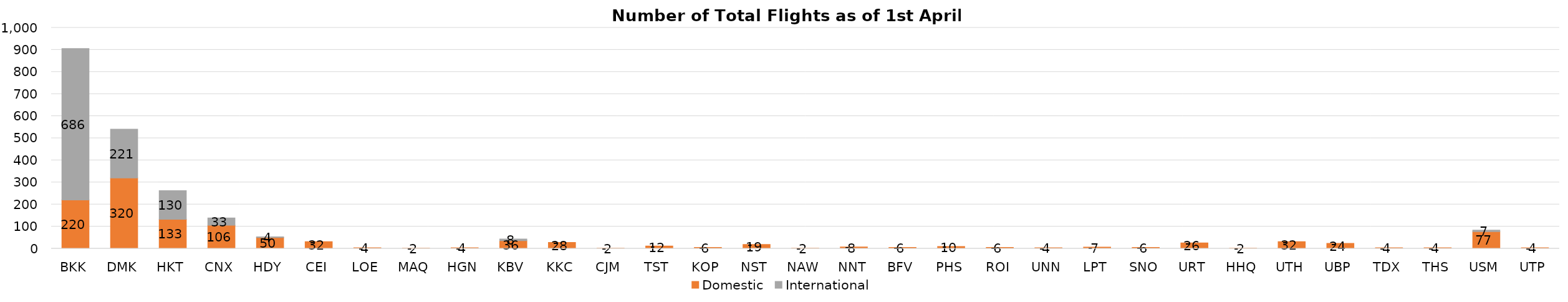
| Category | Domestic | International |
|---|---|---|
| BKK | 220 | 686 |
| DMK | 320 | 221 |
| HKT | 133 | 130 |
| CNX | 106 | 33 |
| HDY | 50 | 4 |
| CEI | 32 | 0 |
| LOE | 4 | 0 |
| MAQ | 2 | 0 |
| HGN | 4 | 0 |
| KBV | 36 | 8 |
| KKC | 28 | 0 |
| CJM | 2 | 0 |
| TST | 12 | 0 |
| KOP | 6 | 0 |
| NST | 19 | 0 |
| NAW | 2 | 0 |
| NNT | 8 | 0 |
| BFV | 6 | 0 |
| PHS | 10 | 0 |
| ROI | 6 | 0 |
| UNN | 4 | 0 |
| LPT | 7 | 0 |
| SNO | 6 | 0 |
| URT | 26 | 0 |
| HHQ | 2 | 0 |
| UTH | 32 | 0 |
| UBP | 24 | 0 |
| TDX | 4 | 0 |
| THS | 4 | 0 |
| USM | 77 | 7 |
| UTP | 4 | 0 |